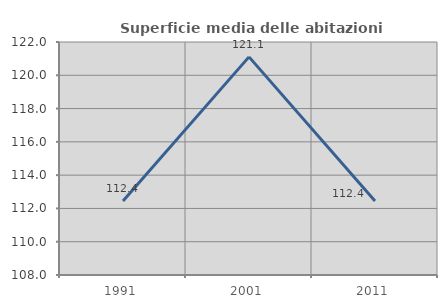
| Category | Superficie media delle abitazioni occupate |
|---|---|
| 1991.0 | 112.444 |
| 2001.0 | 121.106 |
| 2011.0 | 112.443 |